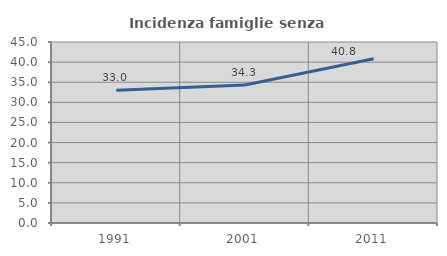
| Category | Incidenza famiglie senza nuclei |
|---|---|
| 1991.0 | 33.014 |
| 2001.0 | 34.328 |
| 2011.0 | 40.845 |